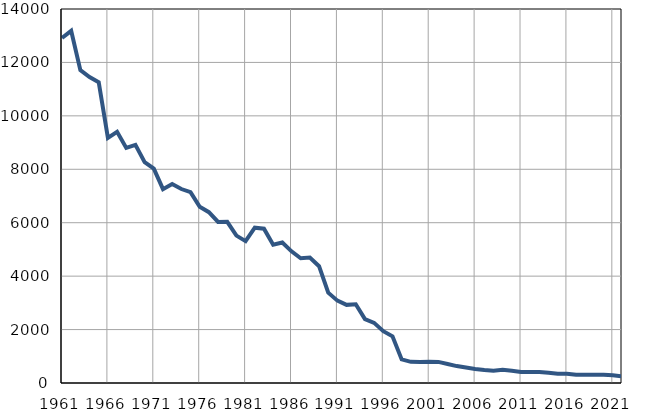
| Category | Умрла 
одојчад |
|---|---|
| 1961.0 | 12917 |
| 1962.0 | 13183 |
| 1963.0 | 11713 |
| 1964.0 | 11454 |
| 1965.0 | 11257 |
| 1966.0 | 9176 |
| 1967.0 | 9403 |
| 1968.0 | 8801 |
| 1969.0 | 8913 |
| 1970.0 | 8267 |
| 1971.0 | 8027 |
| 1972.0 | 7255 |
| 1973.0 | 7449 |
| 1974.0 | 7261 |
| 1975.0 | 7147 |
| 1976.0 | 6594 |
| 1977.0 | 6394 |
| 1978.0 | 6028 |
| 1979.0 | 6033 |
| 1980.0 | 5517 |
| 1981.0 | 5309 |
| 1982.0 | 5815 |
| 1983.0 | 5775 |
| 1984.0 | 5175 |
| 1985.0 | 5260 |
| 1986.0 | 4928 |
| 1987.0 | 4668 |
| 1988.0 | 4695 |
| 1989.0 | 4373 |
| 1990.0 | 3381 |
| 1991.0 | 3083 |
| 1992.0 | 2925 |
| 1993.0 | 2947 |
| 1994.0 | 2392 |
| 1995.0 | 2251 |
| 1996.0 | 1941 |
| 1997.0 | 1746 |
| 1998.0 | 882 |
| 1999.0 | 792 |
| 2000.0 | 785 |
| 2001.0 | 799 |
| 2002.0 | 790 |
| 2003.0 | 711 |
| 2004.0 | 633 |
| 2005.0 | 579 |
| 2006.0 | 525 |
| 2007.0 | 484 |
| 2008.0 | 460 |
| 2009.0 | 492 |
| 2010.0 | 460 |
| 2011.0 | 414 |
| 2012.0 | 415 |
| 2013.0 | 413 |
| 2014.0 | 381 |
| 2015.0 | 346 |
| 2016.0 | 348 |
| 2017.0 | 305 |
| 2018.0 | 311 |
| 2019.0 | 308 |
| 2020.0 | 309 |
| 2021.0 | 293 |
| 2022.0 | 250 |